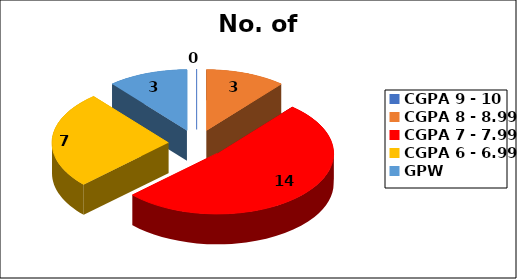
| Category | No. of Students |
|---|---|
| CGPA 9 - 10 | 0 |
| CGPA 8 - 8.99 | 3 |
| CGPA 7 - 7.99 | 14 |
| CGPA 6 - 6.99 | 7 |
| GPW | 3 |